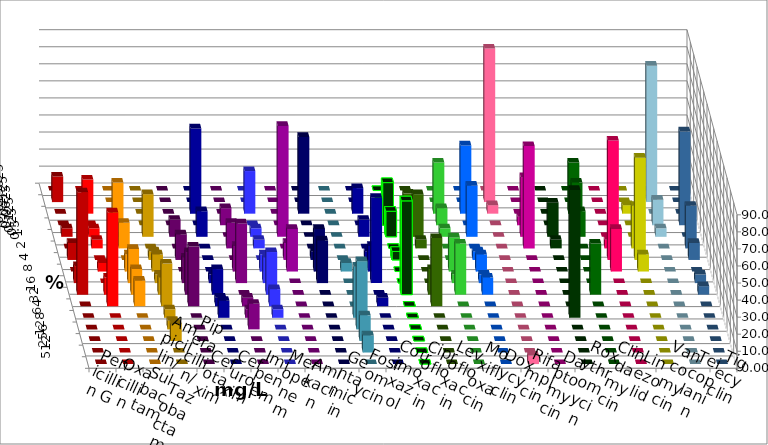
| Category | Penicillin G | Oxacillin | Ampicillin/ Sulbactam | Piperacillin/ Tazobactam | Cefotaxim | Cefuroxim | Imipenem | Meropenem | Amikacin | Gentamicin | Fosfomycin | Cotrimoxazol | Ciprofloxacin | Levofloxacin | Moxifloxacin | Doxycyclin | Rifampicin | Daptomycin | Roxythromycin | Clindamycin | Linezolid | Vancomycin | Teicoplanin | Tigecyclin |
|---|---|---|---|---|---|---|---|---|---|---|---|---|---|---|---|---|---|---|---|---|---|---|---|---|
| 0.015625 | 0 | 0 | 0 | 0 | 0 | 0 | 0 | 0 | 0 | 0 | 0 | 0 | 0 | 0 | 0 | 0 | 0 | 0 | 0 | 0 | 0 | 0 | 0 | 0 |
| 0.03125 | 15 | 0 | 0 | 0 | 0 | 0 | 0 | 0 | 0 | 0 | 0 | 0 | 0 | 5 | 0 | 0 | 90 | 0 | 0 | 0 | 0 | 0 | 0 | 80 |
| 0.0625 | 0 | 20 | 0 | 0 | 0 | 0 | 50 | 25 | 0 | 45 | 0 | 15 | 0 | 0 | 30 | 40 | 5 | 0 | 0 | 30 | 0 | 5 | 0 | 0 |
| 0.125 | 0 | 0 | 25 | 0 | 0 | 10 | 0 | 0 | 0 | 0 | 0 | 0 | 25 | 10 | 10 | 0 | 0 | 5 | 0 | 25 | 0 | 0 | 55 | 15 |
| 0.25 | 5 | 5 | 0 | 25 | 10 | 0 | 15 | 5 | 65 | 0 | 0 | 10 | 15 | 25 | 5 | 30 | 0 | 35 | 20 | 15 | 0 | 0 | 0 | 5 |
| 0.5 | 0 | 5 | 15 | 0 | 0 | 15 | 0 | 5 | 0 | 0 | 0 | 0 | 0 | 5 | 0 | 0 | 0 | 60 | 5 | 0 | 5 | 25 | 25 | 0 |
| 1.0 | 10 | 0 | 0 | 5 | 15 | 0 | 0 | 0 | 10 | 5 | 0 | 5 | 5 | 0 | 0 | 5 | 0 | 0 | 0 | 0 | 70 | 60 | 10 | 0 |
| 2.0 | 0 | 5 | 10 | 10 | 0 | 15 | 0 | 10 | 25 | 25 | 5 | 15 | 0 | 0 | 20 | 10 | 0 | 0 | 0 | 0 | 25 | 10 | 0 | 0 |
| 4.0 | 10 | 0 | 20 | 5 | 15 | 35 | 5 | 15 | 0 | 25 | 0 | 50 | 0 | 0 | 5 | 5 | 0 | 0 | 0 | 0 | 0 | 0 | 5 | 0 |
| 8.0 | 60 | 10 | 15 | 10 | 25 | 0 | 15 | 25 | 0 | 0 | 0 | 0 | 55 | 15 | 30 | 10 | 0 | 0 | 0 | 30 | 0 | 0 | 5 | 0 |
| 16.0 | 0 | 55 | 15 | 25 | 35 | 5 | 5 | 10 | 0 | 0 | 0 | 5 | 0 | 40 | 0 | 0 | 0 | 0 | 0 | 0 | 0 | 0 | 0 | 0 |
| 32.0 | 0 | 0 | 0 | 5 | 0 | 5 | 10 | 5 | 0 | 0 | 30 | 0 | 0 | 0 | 0 | 0 | 0 | 0 | 75 | 0 | 0 | 0 | 0 | 0 |
| 64.0 | 0 | 0 | 0 | 5 | 0 | 15 | 0 | 0 | 0 | 0 | 40 | 0 | 0 | 0 | 0 | 0 | 0 | 0 | 0 | 0 | 0 | 0 | 0 | 0 |
| 128.0 | 0 | 0 | 0 | 10 | 0 | 0 | 0 | 0 | 0 | 0 | 15 | 0 | 0 | 0 | 0 | 0 | 0 | 0 | 0 | 0 | 0 | 0 | 0 | 0 |
| 256.0 | 0 | 0 | 0 | 0 | 0 | 0 | 0 | 0 | 0 | 0 | 10 | 0 | 0 | 0 | 0 | 0 | 0 | 0 | 0 | 0 | 0 | 0 | 0 | 0 |
| 512.0 | 0 | 0 | 0 | 0 | 0 | 0 | 0 | 0 | 0 | 0 | 0 | 0 | 0 | 0 | 0 | 0 | 5 | 0 | 0 | 0 | 0 | 0 | 0 | 0 |